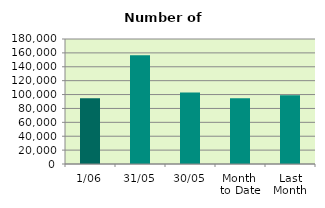
| Category | Series 0 |
|---|---|
| 1/06 | 94574 |
| 31/05 | 156558 |
| 30/05 | 102788 |
| Month 
to Date | 94574 |
| Last
Month | 98885.545 |